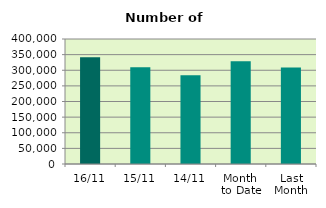
| Category | Series 0 |
|---|---|
| 16/11 | 341826 |
| 15/11 | 309638 |
| 14/11 | 283800 |
| Month 
to Date | 328767.667 |
| Last
Month | 308508.19 |